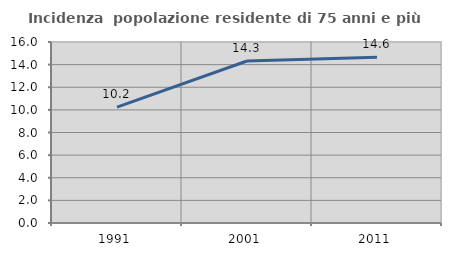
| Category | Incidenza  popolazione residente di 75 anni e più |
|---|---|
| 1991.0 | 10.241 |
| 2001.0 | 14.319 |
| 2011.0 | 14.646 |